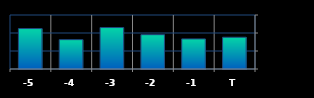
| Category | Series 0 |
|---|---|
| T | 352924 |
| -1 | 334128 |
| -2 | 381104 |
| -3 | 460484 |
| -4 | 325992 |
| -5 | 449428 |